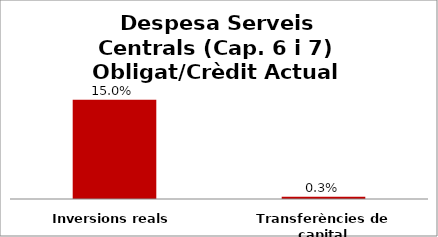
| Category | Series 0 |
|---|---|
| Inversions reals | 0.15 |
| Transferències de capital | 0.003 |